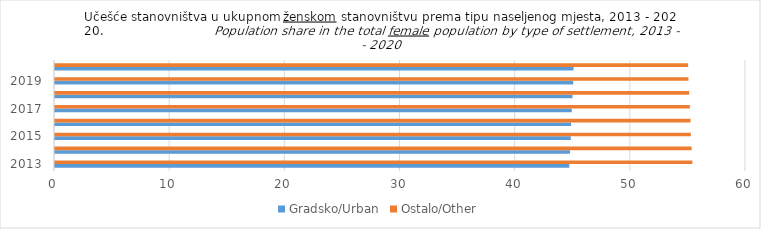
| Category | Gradsko/Urban | Ostalo/Other |
|---|---|---|
| 0 | 44.656 | 55.344 |
| 1 | 44.721 | 55.279 |
| 2 | 44.786 | 55.214 |
| 3 | 44.814 | 55.186 |
| 4 | 44.873 | 55.127 |
| 5 | 44.936 | 55.064 |
| 6 | 44.995 | 55.005 |
| 7 | 45.024 | 54.976 |